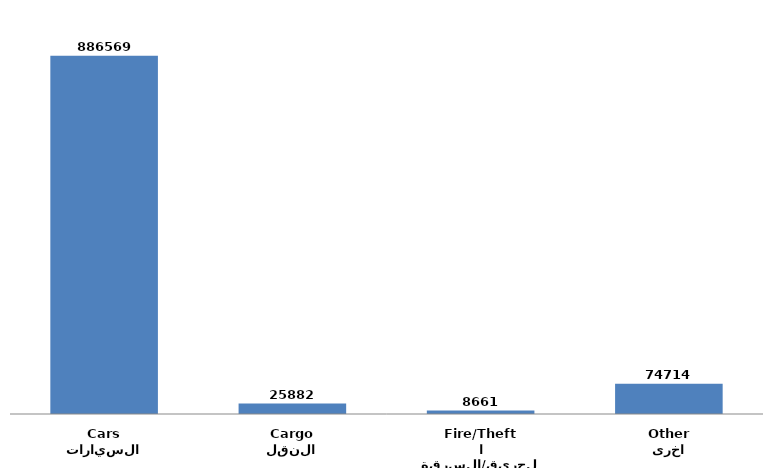
| Category | Series 0 |
|---|---|
| السيارات
Cars | 886569 |
| النقل
Cargo | 25882 |
| الحريق/السرقة
Fire/Theft | 8661 |
| اخرى
Other | 74714 |